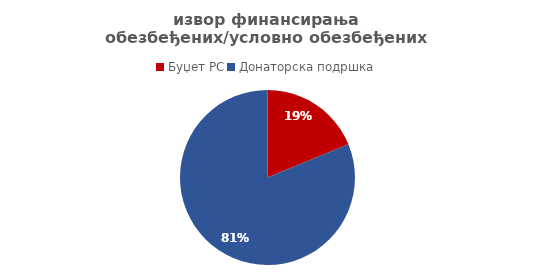
| Category | Series 0 |
|---|---|
| Буџет РС | 176733.346 |
| Донаторска подршка | 764006.796 |